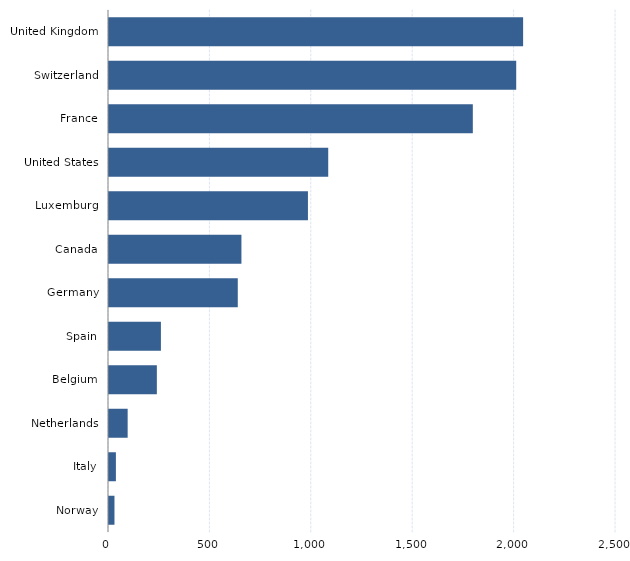
| Category | Series 0 |
|---|---|
| Norway | 27 |
| Italy | 34 |
| Netherlands | 92 |
| Belgium | 236 |
| Spain | 256 |
| Germany | 635 |
| Canada | 653 |
| Luxemburg | 981 |
| United States | 1081 |
| France | 1794 |
| Switzerland | 2008 |
| United Kingdom | 2042 |